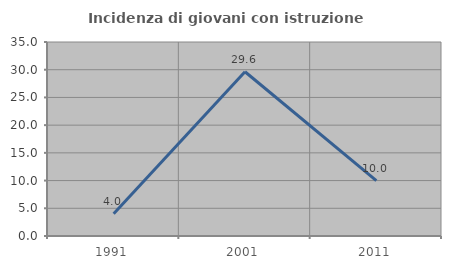
| Category | Incidenza di giovani con istruzione universitaria |
|---|---|
| 1991.0 | 4 |
| 2001.0 | 29.63 |
| 2011.0 | 10 |